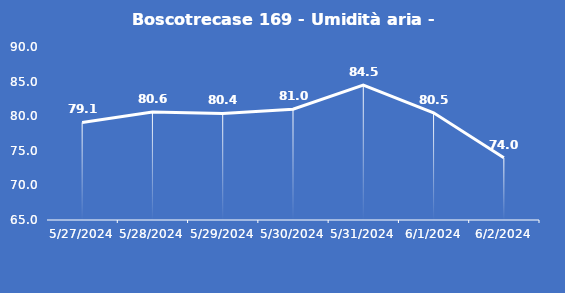
| Category | Boscotrecase 169 - Umidità aria - Grezzo (%) |
|---|---|
| 5/27/24 | 79.1 |
| 5/28/24 | 80.6 |
| 5/29/24 | 80.4 |
| 5/30/24 | 81 |
| 5/31/24 | 84.5 |
| 6/1/24 | 80.5 |
| 6/2/24 | 74 |